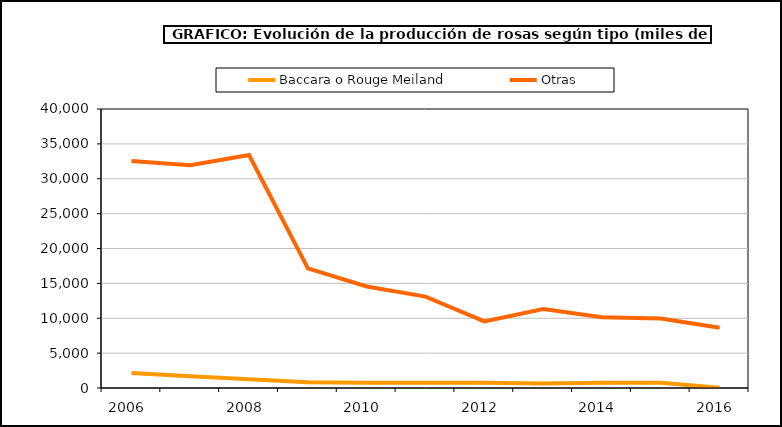
| Category | Baccara o Rouge Meiland | Otras |
|---|---|---|
| 2006.0 | 2137 | 32544 |
| 2007.0 | 1675 | 31941 |
| 2008.0 | 1250 | 33407 |
| 2009.0 | 836 | 17147 |
| 2010.0 | 741 | 14560 |
| 2011.0 | 741 | 13099 |
| 2012.0 | 741 | 9551 |
| 2013.0 | 662 | 11331 |
| 2014.0 | 739 | 10158 |
| 2015.0 | 756 | 9969 |
| 2016.0 | 38 | 8644 |